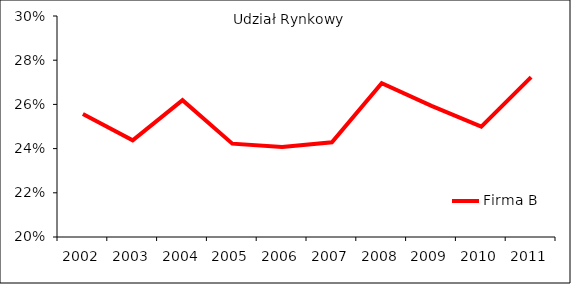
| Category | Firma B |
|---|---|
| 2002.0 | 0.256 |
| 2003.0 | 0.244 |
| 2004.0 | 0.262 |
| 2005.0 | 0.242 |
| 2006.0 | 0.241 |
| 2007.0 | 0.243 |
| 2008.0 | 0.27 |
| 2009.0 | 0.259 |
| 2010.0 | 0.25 |
| 2011.0 | 0.272 |